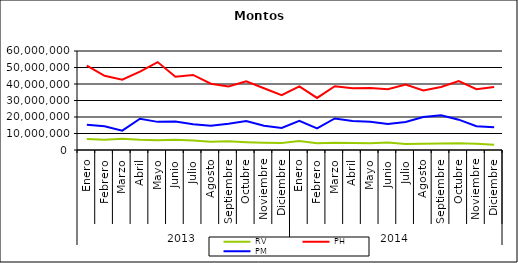
| Category | RV | PH | PM |
|---|---|---|---|
| 0 | 6603412.357 | 51097257.501 | 15291994.497 |
| 1 | 6144371.716 | 44938482.89 | 14418861.164 |
| 2 | 6870539.137 | 42574717.992 | 11735480.075 |
| 3 | 6139858.354 | 47535968.024 | 18924825.739 |
| 4 | 5890476.617 | 53273527.932 | 17047621.863 |
| 5 | 6142686.449 | 44450017.2 | 17254269.094 |
| 6 | 5792277.798 | 45481930.674 | 15546714.502 |
| 7 | 4962192.427 | 40196203.529 | 14644148.591 |
| 8 | 5244267.415 | 38549056.812 | 15946518.356 |
| 9 | 4723321.466 | 41614732.22 | 17536811.707 |
| 10 | 4437368.656 | 37439358.84 | 14761398.421 |
| 11 | 4226608.984 | 33178083.97 | 13384599.022 |
| 12 | 5420667.417 | 38592535.269 | 17738595.757 |
| 13 | 4106438.771 | 31549668.118 | 13082413.394 |
| 14 | 4333641.03 | 38643419.598 | 19107804.717 |
| 15 | 4275572.01 | 37358737.373 | 17555594.298 |
| 16 | 4139390.073 | 37637742.383 | 17146834.395 |
| 17 | 4553837.188 | 36763239.571 | 15771052.834 |
| 18 | 3703149.165 | 39606057.082 | 16994946.064 |
| 19 | 3782918.817 | 36051238.49 | 19934925.294 |
| 20 | 3865511.016 | 38158385.619 | 21028953.635 |
| 21 | 4039426.107 | 41798244.765 | 18387198.681 |
| 22 | 3787909.354 | 36802189.987 | 14381727.201 |
| 23 | 3108297.469 | 38250157.702 | 13759081.113 |